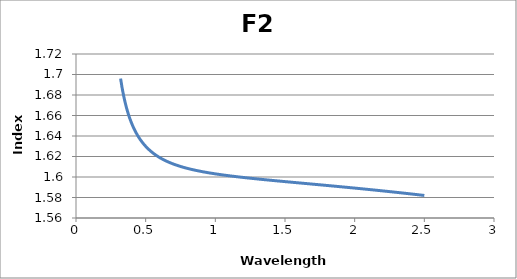
| Category | F2 |
|---|---|
| 0.32 | 1.696 |
| 0.33 | 1.688 |
| 0.34 | 1.68 |
| 0.35 | 1.674 |
| 0.36 | 1.669 |
| 0.37 | 1.664 |
| 0.38 | 1.66 |
| 0.39 | 1.656 |
| 0.4 | 1.652 |
| 0.41 | 1.649 |
| 0.42 | 1.646 |
| 0.43 | 1.643 |
| 0.44 | 1.641 |
| 0.45 | 1.639 |
| 0.46 | 1.637 |
| 0.47 | 1.635 |
| 0.48 | 1.633 |
| 0.49 | 1.631 |
| 0.5 | 1.63 |
| 0.51 | 1.629 |
| 0.52 | 1.627 |
| 0.53 | 1.626 |
| 0.54 | 1.625 |
| 0.55 | 1.624 |
| 0.56 | 1.623 |
| 0.57 | 1.622 |
| 0.58 | 1.621 |
| 0.59 | 1.62 |
| 0.6 | 1.619 |
| 0.61 | 1.618 |
| 0.62 | 1.617 |
| 0.63 | 1.617 |
| 0.64 | 1.616 |
| 0.65 | 1.615 |
| 0.66 | 1.615 |
| 0.67 | 1.614 |
| 0.68 | 1.614 |
| 0.69 | 1.613 |
| 0.7 | 1.613 |
| 0.71 | 1.612 |
| 0.72 | 1.612 |
| 0.73 | 1.611 |
| 0.74 | 1.611 |
| 0.75 | 1.61 |
| 0.76 | 1.61 |
| 0.77 | 1.609 |
| 0.78 | 1.609 |
| 0.79 | 1.609 |
| 0.8 | 1.608 |
| 0.81 | 1.608 |
| 0.82 | 1.608 |
| 0.83 | 1.607 |
| 0.84 | 1.607 |
| 0.85 | 1.607 |
| 0.86 | 1.606 |
| 0.87 | 1.606 |
| 0.88 | 1.606 |
| 0.890000000000001 | 1.606 |
| 0.900000000000001 | 1.605 |
| 0.910000000000001 | 1.605 |
| 0.920000000000001 | 1.605 |
| 0.930000000000001 | 1.605 |
| 0.940000000000001 | 1.604 |
| 0.950000000000001 | 1.604 |
| 0.960000000000001 | 1.604 |
| 0.970000000000001 | 1.604 |
| 0.980000000000001 | 1.603 |
| 0.990000000000001 | 1.603 |
| 1.0 | 1.603 |
| 1.01 | 1.603 |
| 1.02 | 1.603 |
| 1.03 | 1.602 |
| 1.04 | 1.602 |
| 1.05 | 1.602 |
| 1.06 | 1.602 |
| 1.07 | 1.602 |
| 1.08 | 1.602 |
| 1.09 | 1.601 |
| 1.1 | 1.601 |
| 1.11 | 1.601 |
| 1.12 | 1.601 |
| 1.13 | 1.601 |
| 1.14 | 1.601 |
| 1.15 | 1.6 |
| 1.16 | 1.6 |
| 1.17 | 1.6 |
| 1.18 | 1.6 |
| 1.19 | 1.6 |
| 1.2 | 1.6 |
| 1.21 | 1.599 |
| 1.22 | 1.599 |
| 1.23 | 1.599 |
| 1.24 | 1.599 |
| 1.25 | 1.599 |
| 1.26 | 1.599 |
| 1.27 | 1.599 |
| 1.28 | 1.598 |
| 1.29 | 1.598 |
| 1.3 | 1.598 |
| 1.31 | 1.598 |
| 1.32 | 1.598 |
| 1.33 | 1.598 |
| 1.34 | 1.598 |
| 1.35 | 1.597 |
| 1.36 | 1.597 |
| 1.37 | 1.597 |
| 1.38 | 1.597 |
| 1.39 | 1.597 |
| 1.4 | 1.597 |
| 1.41 | 1.597 |
| 1.42 | 1.597 |
| 1.43 | 1.596 |
| 1.44 | 1.596 |
| 1.45 | 1.596 |
| 1.46 | 1.596 |
| 1.47 | 1.596 |
| 1.48 | 1.596 |
| 1.49 | 1.596 |
| 1.5 | 1.596 |
| 1.51 | 1.595 |
| 1.52 | 1.595 |
| 1.53 | 1.595 |
| 1.54 | 1.595 |
| 1.55 | 1.595 |
| 1.56 | 1.595 |
| 1.57 | 1.595 |
| 1.58 | 1.594 |
| 1.59 | 1.594 |
| 1.6 | 1.594 |
| 1.61 | 1.594 |
| 1.62 | 1.594 |
| 1.63 | 1.594 |
| 1.64 | 1.594 |
| 1.65 | 1.594 |
| 1.66 | 1.594 |
| 1.67 | 1.593 |
| 1.68 | 1.593 |
| 1.69 | 1.593 |
| 1.7 | 1.593 |
| 1.71 | 1.593 |
| 1.72 | 1.593 |
| 1.73 | 1.593 |
| 1.74 | 1.593 |
| 1.75 | 1.592 |
| 1.76 | 1.592 |
| 1.77 | 1.592 |
| 1.78 | 1.592 |
| 1.79 | 1.592 |
| 1.8 | 1.592 |
| 1.81 | 1.592 |
| 1.82 | 1.592 |
| 1.83 | 1.591 |
| 1.84 | 1.591 |
| 1.85 | 1.591 |
| 1.86 | 1.591 |
| 1.87 | 1.591 |
| 1.88 | 1.591 |
| 1.89 | 1.591 |
| 1.9 | 1.59 |
| 1.91 | 1.59 |
| 1.92 | 1.59 |
| 1.93 | 1.59 |
| 1.94 | 1.59 |
| 1.95 | 1.59 |
| 1.96 | 1.59 |
| 1.97 | 1.59 |
| 1.98 | 1.589 |
| 1.99 | 1.589 |
| 2.0 | 1.589 |
| 2.01 | 1.589 |
| 2.02 | 1.589 |
| 2.03 | 1.589 |
| 2.04 | 1.589 |
| 2.05 | 1.589 |
| 2.06 | 1.588 |
| 2.07 | 1.588 |
| 2.08 | 1.588 |
| 2.09 | 1.588 |
| 2.1 | 1.588 |
| 2.11 | 1.588 |
| 2.12 | 1.588 |
| 2.13 | 1.587 |
| 2.14 | 1.587 |
| 2.15 | 1.587 |
| 2.16 | 1.587 |
| 2.17 | 1.587 |
| 2.18 | 1.587 |
| 2.19 | 1.587 |
| 2.2 | 1.586 |
| 2.21 | 1.586 |
| 2.22 | 1.586 |
| 2.23 | 1.586 |
| 2.24 | 1.586 |
| 2.25 | 1.586 |
| 2.26 | 1.586 |
| 2.27 | 1.585 |
| 2.28 | 1.585 |
| 2.29 | 1.585 |
| 2.3 | 1.585 |
| 2.31 | 1.585 |
| 2.32 | 1.585 |
| 2.33 | 1.585 |
| 2.34 | 1.584 |
| 2.35 | 1.584 |
| 2.36 | 1.584 |
| 2.37 | 1.584 |
| 2.38 | 1.584 |
| 2.39 | 1.584 |
| 2.4 | 1.584 |
| 2.41 | 1.583 |
| 2.42 | 1.583 |
| 2.43 | 1.583 |
| 2.44 | 1.583 |
| 2.45 | 1.583 |
| 2.46 | 1.583 |
| 2.47 | 1.582 |
| 2.48 | 1.582 |
| 2.49 | 1.582 |
| 2.5 | 1.582 |